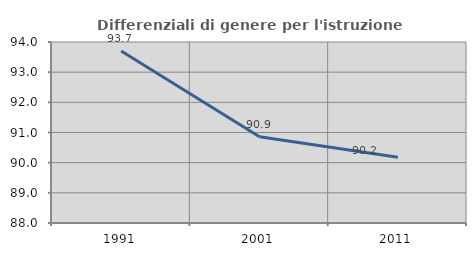
| Category | Differenziali di genere per l'istruzione superiore |
|---|---|
| 1991.0 | 93.703 |
| 2001.0 | 90.861 |
| 2011.0 | 90.176 |